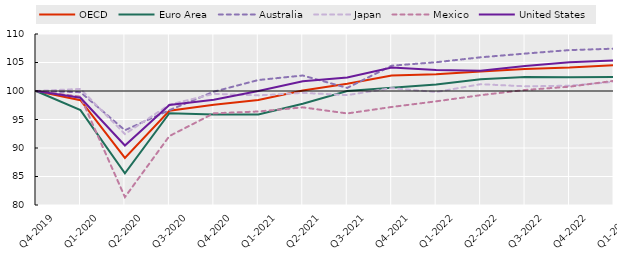
| Category | OECD | Euro Area | Australia | Japan | Mexico | United States |
|---|---|---|---|---|---|---|
| Q4-2019 | 100 | 100 | 100 | 100 | 100 | 100 |
| Q1-2020 | 98.395 | 96.65 | 99.793 | 100.365 | 99.012 | 98.825 |
| Q2-2020 | 88.258 | 85.551 | 93.114 | 92.441 | 81.383 | 90.44 |
| Q3-2020 | 96.543 | 96.103 | 96.641 | 97.611 | 92.097 | 97.544 |
| Q4-2020 | 97.581 | 95.884 | 99.882 | 99.505 | 96.087 | 98.483 |
| Q1-2021 | 98.418 | 95.891 | 101.926 | 99.23 | 96.405 | 100.003 |
| Q2-2021 | 100.105 | 97.764 | 102.719 | 99.673 | 97.132 | 101.71 |
| Q3-2021 | 101.263 | 99.991 | 100.542 | 99.277 | 96.062 | 102.378 |
| Q4-2021 | 102.702 | 100.557 | 104.44 | 100.505 | 97.197 | 104.114 |
| Q1-2022 | 102.939 | 101.161 | 105.047 | 99.818 | 98.186 | 103.687 |
| Q2-2022 | 103.413 | 102.074 | 105.914 | 101.193 | 99.27 | 103.537 |
| Q3-2022 | 103.874 | 102.458 | 106.563 | 100.823 | 100.179 | 104.366 |
| Q4-2022 | 104.104 | 102.407 | 107.178 | 100.927 | 100.758 | 105.031 |
| Q1-2023 | 104.521 | 102.478 | 107.428 | 101.608 | 101.787 | 105.364 |